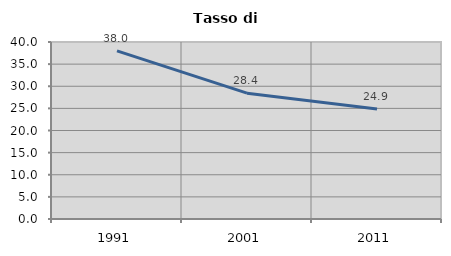
| Category | Tasso di disoccupazione   |
|---|---|
| 1991.0 | 37.999 |
| 2001.0 | 28.432 |
| 2011.0 | 24.878 |